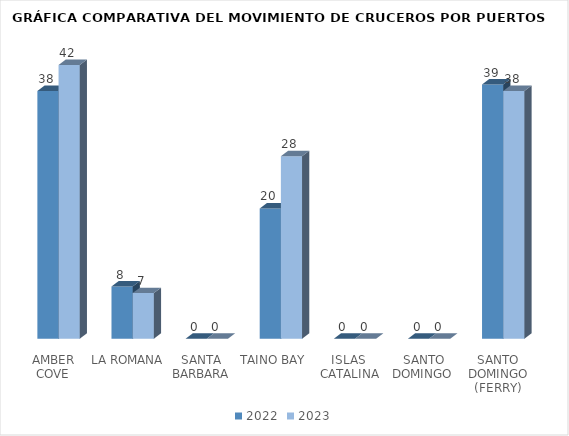
| Category | 2022 | 2023 |
|---|---|---|
| AMBER COVE | 38 | 42 |
| LA ROMANA | 8 | 7 |
| SANTA BARBARA | 0 | 0 |
| TAINO BAY | 20 | 28 |
| ISLAS  CATALINA | 0 | 0 |
| SANTO DOMINGO  | 0 | 0 |
| SANTO DOMINGO (FERRY) | 39 | 38 |